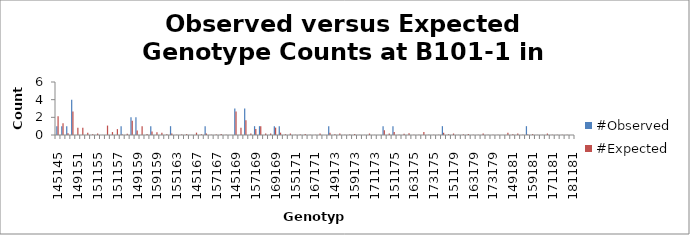
| Category | #Observed | #Expected |
|---|---|---|
| 145145.0 | 1 | 2.133 |
| 145149.0 | 1 | 1.333 |
| 149149.0 | 1 | 0.208 |
| 145151.0 | 4 | 2.667 |
| 149151.0 | 0 | 0.833 |
| 151151.0 | 0 | 0.833 |
| 145155.0 | 0 | 0.267 |
| 149155.0 | 0 | 0.083 |
| 151155.0 | 0 | 0.167 |
| 155155.0 | 0 | 0.008 |
| 145157.0 | 0 | 1.067 |
| 149157.0 | 0 | 0.333 |
| 151157.0 | 0 | 0.667 |
| 155157.0 | 1 | 0.067 |
| 157157.0 | 0 | 0.133 |
| 145159.0 | 2 | 1.6 |
| 149159.0 | 2 | 0.5 |
| 151159.0 | 0 | 1 |
| 155159.0 | 0 | 0.1 |
| 157159.0 | 1 | 0.4 |
| 159159.0 | 0 | 0.3 |
| 145163.0 | 0 | 0.267 |
| 149163.0 | 0 | 0.083 |
| 151163.0 | 1 | 0.167 |
| 155163.0 | 0 | 0.017 |
| 157163.0 | 0 | 0.067 |
| 159163.0 | 0 | 0.1 |
| 163163.0 | 0 | 0.008 |
| 145167.0 | 0 | 0.267 |
| 149167.0 | 0 | 0.083 |
| 151167.0 | 1 | 0.167 |
| 155167.0 | 0 | 0.017 |
| 157167.0 | 0 | 0.067 |
| 159167.0 | 0 | 0.1 |
| 163167.0 | 0 | 0.017 |
| 167167.0 | 0 | 0.008 |
| 145169.0 | 3 | 2.667 |
| 149169.0 | 0 | 0.833 |
| 151169.0 | 3 | 1.667 |
| 155169.0 | 0 | 0.167 |
| 157169.0 | 1 | 0.667 |
| 159169.0 | 1 | 1 |
| 163169.0 | 0 | 0.167 |
| 167169.0 | 0 | 0.167 |
| 169169.0 | 1 | 0.833 |
| 145171.0 | 1 | 0.267 |
| 149171.0 | 0 | 0.083 |
| 151171.0 | 0 | 0.167 |
| 155171.0 | 0 | 0.017 |
| 157171.0 | 0 | 0.067 |
| 159171.0 | 0 | 0.1 |
| 163171.0 | 0 | 0.017 |
| 167171.0 | 0 | 0.017 |
| 169171.0 | 0 | 0.167 |
| 171171.0 | 0 | 0.008 |
| 145173.0 | 1 | 0.267 |
| 149173.0 | 0 | 0.083 |
| 151173.0 | 0 | 0.167 |
| 155173.0 | 0 | 0.017 |
| 157173.0 | 0 | 0.067 |
| 159173.0 | 0 | 0.1 |
| 163173.0 | 0 | 0.017 |
| 167173.0 | 0 | 0.017 |
| 169173.0 | 0 | 0.167 |
| 171173.0 | 0 | 0.017 |
| 173173.0 | 0 | 0.008 |
| 145175.0 | 1 | 0.533 |
| 149175.0 | 0 | 0.167 |
| 151175.0 | 1 | 0.333 |
| 155175.0 | 0 | 0.033 |
| 157175.0 | 0 | 0.133 |
| 159175.0 | 0 | 0.2 |
| 163175.0 | 0 | 0.033 |
| 167175.0 | 0 | 0.033 |
| 169175.0 | 0 | 0.333 |
| 171175.0 | 0 | 0.033 |
| 173175.0 | 0 | 0.033 |
| 175175.0 | 0 | 0.033 |
| 145179.0 | 1 | 0.267 |
| 149179.0 | 0 | 0.083 |
| 151179.0 | 0 | 0.167 |
| 155179.0 | 0 | 0.017 |
| 157179.0 | 0 | 0.067 |
| 159179.0 | 0 | 0.1 |
| 163179.0 | 0 | 0.017 |
| 167179.0 | 0 | 0.017 |
| 169179.0 | 0 | 0.167 |
| 171179.0 | 0 | 0.017 |
| 173179.0 | 0 | 0.017 |
| 175179.0 | 0 | 0.033 |
| 179179.0 | 0 | 0.008 |
| 145181.0 | 0 | 0.267 |
| 149181.0 | 0 | 0.083 |
| 151181.0 | 0 | 0.167 |
| 155181.0 | 0 | 0.017 |
| 157181.0 | 1 | 0.067 |
| 159181.0 | 0 | 0.1 |
| 163181.0 | 0 | 0.017 |
| 167181.0 | 0 | 0.017 |
| 169181.0 | 0 | 0.167 |
| 171181.0 | 0 | 0.017 |
| 173181.0 | 0 | 0.017 |
| 175181.0 | 0 | 0.033 |
| 179181.0 | 0 | 0.017 |
| 181181.0 | 0 | 0.008 |